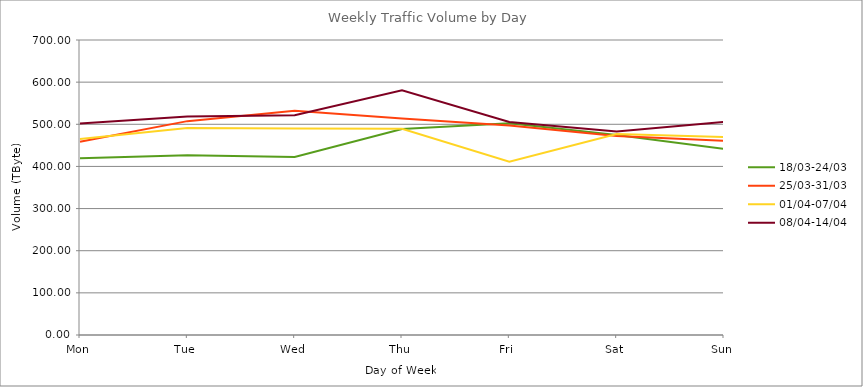
| Category | 18/03-24/03 | 25/03-31/03 | 01/04-07/04 | 08/04-14/04 |
|---|---|---|---|---|
| Mon | 419.54 | 458.64 | 465.2 | 502.11 |
| Tue | 426.27 | 507.48 | 491.11 | 518.4 |
| Wed | 422.41 | 531.96 | 490.03 | 521.36 |
| Thu | 488.89 | 513.98 | 489.59 | 580.47 |
| Fri | 502.62 | 497.07 | 411.2 | 505.62 |
| Sat | 474.55 | 472.08 | 476.67 | 482.82 |
| Sun | 441.91 | 461.09 | 469.76 | 505.8 |